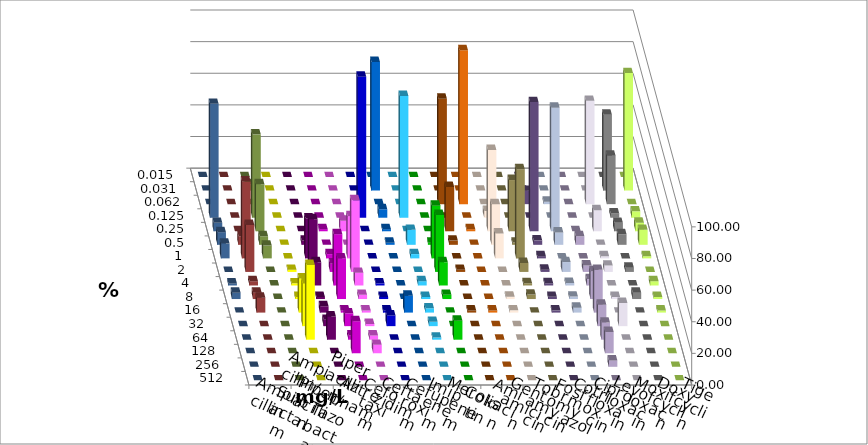
| Category | Ampicillin | Ampicillin/ Sulbactam | Piperacillin | Piperacillin/ Tazobactam | Aztreonam | Cefotaxim | Ceftazidim | Cefuroxim | Imipenem | Meropenem | Colistin | Amikacin | Gentamicin | Tobramycin | Fosfomycin | Cotrimoxazol | Ciprofloxacin | Levofloxacin | Moxifloxacin | Doxycyclin | Tigecyclin |
|---|---|---|---|---|---|---|---|---|---|---|---|---|---|---|---|---|---|---|---|---|---|
| 0.015 | 0 | 0 | 0 | 0 | 0 | 0 | 0 | 0 | 0 | 0 | 0 | 0 | 0 | 0 | 0 | 0 | 0 | 0 | 0 | 0 | 0 |
| 0.031 | 0 | 0 | 0 | 0 | 0 | 81.333 | 0 | 0 | 0 | 0 | 0 | 0 | 0 | 0 | 0 | 0 | 48 | 74.324 | 0 | 0 | 4.054 |
| 0.062 | 0 | 0 | 0 | 0 | 0 | 0 | 0 | 0 | 66.667 | 97.333 | 0 | 0 | 8.451 | 1.562 | 0 | 65.333 | 30.667 | 0 | 0 | 0 | 0 |
| 0.125 | 0 | 0 | 0 | 0 | 89.189 | 5.333 | 77.027 | 0 | 0 | 0 | 4.286 | 0 | 0 | 0 | 0 | 0 | 2.667 | 4.054 | 72 | 0 | 52.703 |
| 0.25 | 0 | 0 | 1.351 | 6.667 | 0 | 1.333 | 0 | 0 | 28 | 1.333 | 51.429 | 32.394 | 81.69 | 78.125 | 0 | 13.333 | 5.333 | 5.405 | 5.333 | 0 | 29.73 |
| 0.5 | 0 | 2.667 | 0 | 0 | 0 | 1.333 | 9.459 | 1.333 | 2.667 | 0 | 25.714 | 1.408 | 2.817 | 7.812 | 5.405 | 0 | 6.667 | 9.459 | 8 | 5.405 | 5.405 |
| 1.0 | 0 | 25.333 | 2.703 | 26.667 | 0 | 0 | 2.703 | 33.333 | 0 | 0 | 15.714 | 56.338 | 1.408 | 0 | 0 | 1.333 | 0 | 1.351 | 9.333 | 48.649 | 8.108 |
| 2.0 | 1.351 | 33.333 | 5.405 | 45.333 | 0 | 0 | 0 | 36 | 1.333 | 0 | 0 | 5.634 | 1.408 | 6.25 | 4.054 | 4 | 2.667 | 0 | 0 | 29.73 | 0 |
| 4.0 | 1.351 | 14.667 | 32.432 | 8 | 1.351 | 0 | 2.703 | 14.667 | 0 | 0 | 0 | 1.408 | 1.408 | 1.562 | 4.054 | 0 | 0 | 2.703 | 1.333 | 2.703 | 0 |
| 8.0 | 1.351 | 1.333 | 25.676 | 2.667 | 1.351 | 0 | 1.351 | 2.667 | 0 | 0 | 1.429 | 2.817 | 1.408 | 1.562 | 17.568 | 1.333 | 4 | 1.351 | 4 | 4.054 | 0 |
| 16.0 | 21.622 | 4 | 1.351 | 1.333 | 1.351 | 10.667 | 2.703 | 0 | 1.333 | 1.333 | 1.429 | 0 | 1.408 | 3.125 | 27.027 | 0 | 0 | 1.351 | 0 | 9.459 | 0 |
| 32.0 | 27.027 | 4 | 8.108 | 1.333 | 6.757 | 0 | 2.703 | 0 | 0 | 0 | 0 | 0 | 0 | 0 | 13.514 | 14.667 | 0 | 0 | 0 | 0 | 0 |
| 64.0 | 47.297 | 14.667 | 2.703 | 2.667 | 0 | 0 | 1.351 | 12 | 0 | 0 | 0 | 0 | 0 | 0 | 10.811 | 0 | 0 | 0 | 0 | 0 | 0 |
| 128.0 | 0 | 0 | 20.27 | 5.333 | 0 | 0 | 0 | 0 | 0 | 0 | 0 | 0 | 0 | 0 | 13.514 | 0 | 0 | 0 | 0 | 0 | 0 |
| 256.0 | 0 | 0 | 0 | 0 | 0 | 0 | 0 | 0 | 0 | 0 | 0 | 0 | 0 | 0 | 4.054 | 0 | 0 | 0 | 0 | 0 | 0 |
| 512.0 | 0 | 0 | 0 | 0 | 0 | 0 | 0 | 0 | 0 | 0 | 0 | 0 | 0 | 0 | 0 | 0 | 0 | 0 | 0 | 0 | 0 |